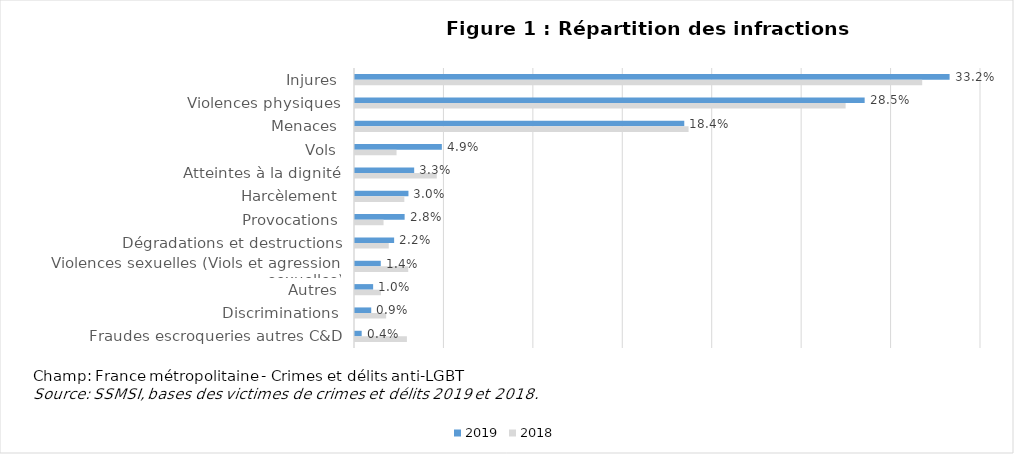
| Category | 2019 | 2018 |
|---|---|---|
| Injures | 0.332 | 0.317 |
| Violences physiques | 0.285 | 0.274 |
| Menaces | 0.184 | 0.187 |
| Vols | 0.049 | 0.023 |
| Atteintes à la dignité | 0.033 | 0.046 |
| Harcèlement | 0.03 | 0.028 |
| Provocations | 0.028 | 0.016 |
| Dégradations et destructions | 0.022 | 0.019 |
| Violences sexuelles (Viols et agressions sexuelles) | 0.014 | 0.03 |
| Autres | 0.01 | 0.015 |
| Discriminations | 0.009 | 0.017 |
| Fraudes escroqueries autres C&D | 0.004 | 0.029 |